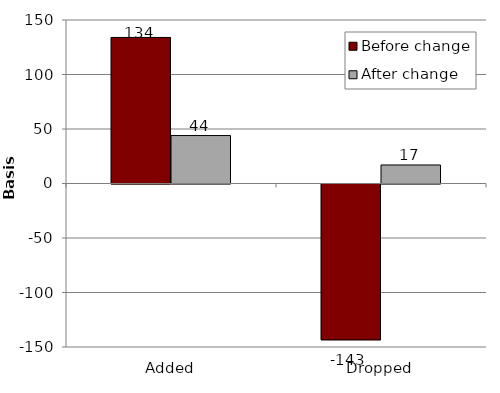
| Category | Before change | After change |
|---|---|---|
| Added | 134 | 44 |
| Dropped | -143 | 17 |